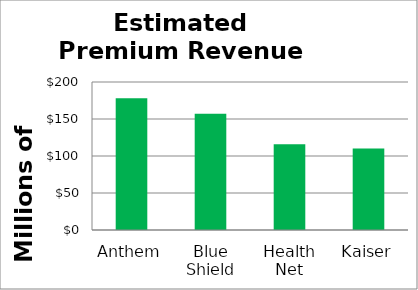
| Category | Dollars |
|---|---|
| Anthem | 178 |
| Blue Shield | 157 |
| Health Net | 116 |
| Kaiser | 110 |